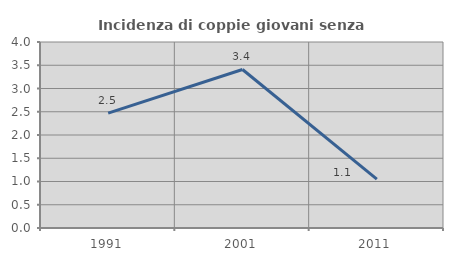
| Category | Incidenza di coppie giovani senza figli |
|---|---|
| 1991.0 | 2.469 |
| 2001.0 | 3.409 |
| 2011.0 | 1.053 |